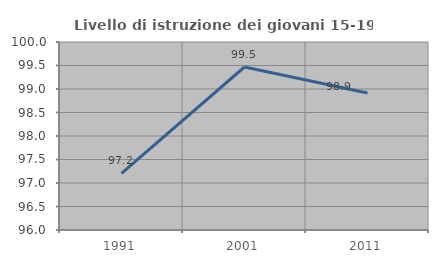
| Category | Livello di istruzione dei giovani 15-19 anni |
|---|---|
| 1991.0 | 97.207 |
| 2001.0 | 99.468 |
| 2011.0 | 98.913 |